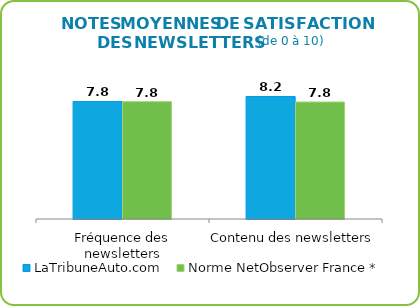
| Category | LaTribuneAuto.com | Norme NetObserver France * |
|---|---|---|
| Fréquence des newsletters | 7.833 | 7.824 |
| Contenu des newsletters | 8.167 | 7.799 |